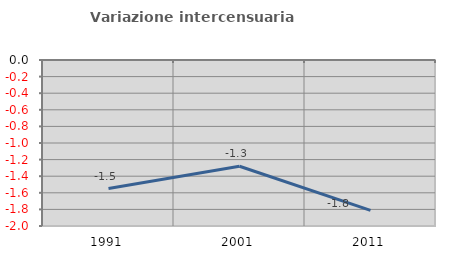
| Category | Variazione intercensuaria annua |
|---|---|
| 1991.0 | -1.549 |
| 2001.0 | -1.28 |
| 2011.0 | -1.811 |